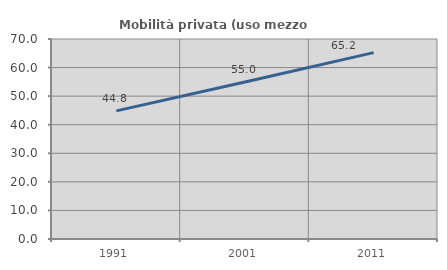
| Category | Mobilità privata (uso mezzo privato) |
|---|---|
| 1991.0 | 44.839 |
| 2001.0 | 54.974 |
| 2011.0 | 65.229 |